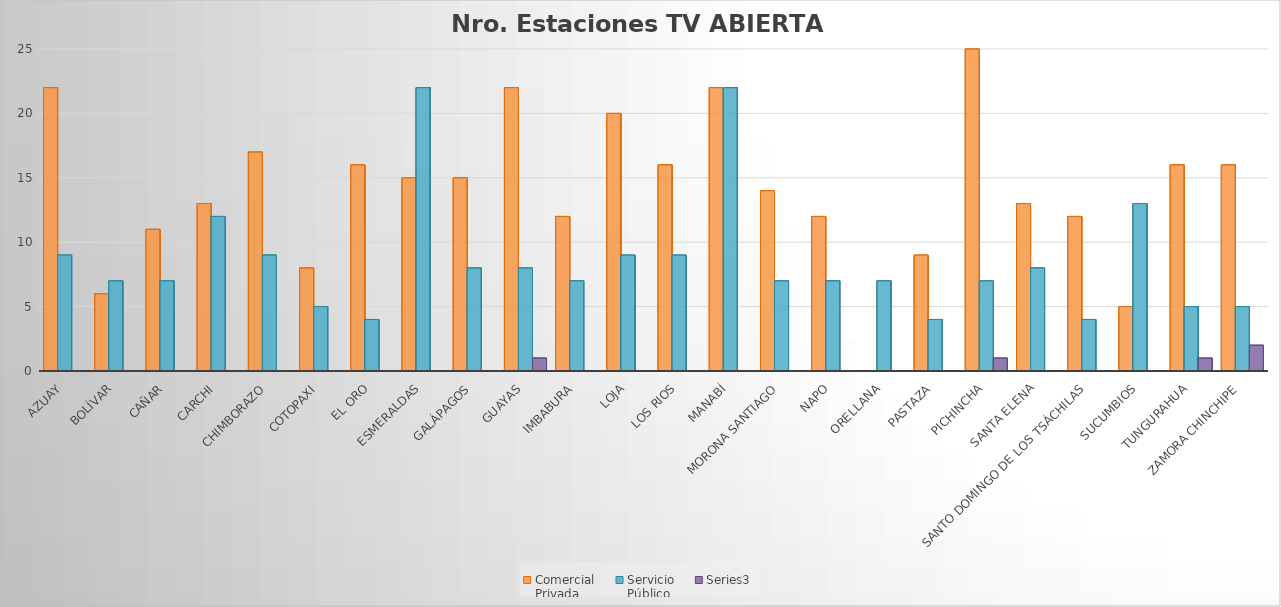
| Category | Comercial 
Privada | Servicio 
Público | Series 2 |
|---|---|---|---|
| Azuay | 22 | 9 | 0 |
| Bolívar | 6 | 7 | 0 |
| Cañar | 11 | 7 | 0 |
| Carchi | 13 | 12 | 0 |
| Chimborazo | 17 | 9 | 0 |
| Cotopaxi | 8 | 5 | 0 |
| El Oro | 16 | 4 | 0 |
| Esmeraldas | 15 | 22 | 0 |
| Galápagos | 15 | 8 | 0 |
| Guayas | 22 | 8 | 1 |
| Imbabura | 12 | 7 | 0 |
| Loja | 20 | 9 | 0 |
| Los Rios | 16 | 9 | 0 |
| Manabí | 22 | 22 | 0 |
| Morona Santiago | 14 | 7 | 0 |
| Napo | 12 | 7 | 0 |
| Orellana | 0 | 7 | 0 |
| Pastaza | 9 | 4 | 0 |
| Pichincha | 25 | 7 | 1 |
| Santa Elena | 13 | 8 | 0 |
| Santo Domingo de los Tsáchilas | 12 | 4 | 0 |
| Sucumbios | 5 | 13 | 0 |
| Tungurahua | 16 | 5 | 1 |
| Zamora Chinchipe | 16 | 5 | 2 |